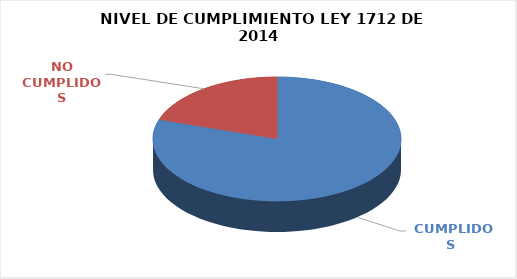
| Category | Series 0 |
|---|---|
|  CUMPLIDOS | 92 |
| NO CUMPLIDOS | 23 |